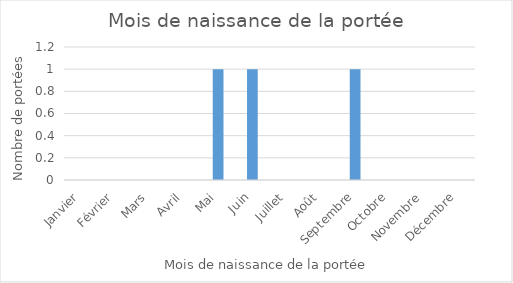
| Category | Series 0 |
|---|---|
| Janvier | 0 |
| Février | 0 |
| Mars | 0 |
| Avril | 0 |
| Mai | 1 |
| Juin | 1 |
| Juillet | 0 |
| Août | 0 |
| Septembre | 1 |
| Octobre | 0 |
| Novembre | 0 |
| Décembre | 0 |